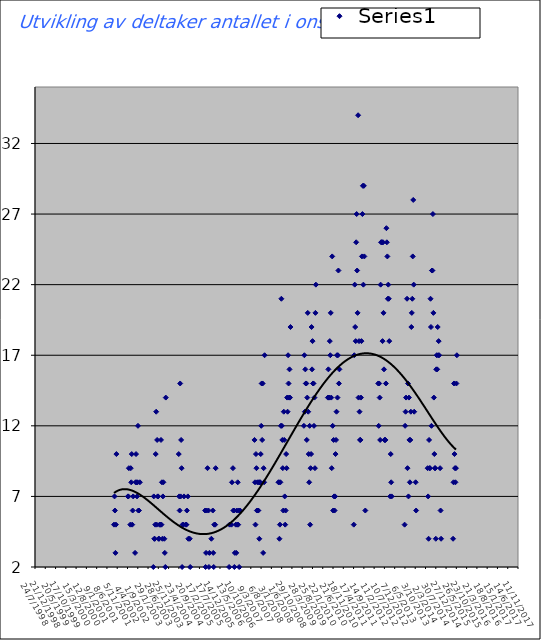
| Category | Series 0 |
|---|---|
| 37153.0 | 5 |
| 37161.0 | 7 |
| 37167.0 | 6 |
| 37174.0 | 3 |
| 37181.0 | 5 |
| 37188.0 | 10 |
| 37356.0 | 7 |
| 37363.0 | 7 |
| 37370.0 | 9 |
| 37391.0 | 5 |
| 37398.0 | 9 |
| 37405.0 | 8 |
| 37412.0 | 10 |
| 37419.0 | 5 |
| 37426.0 | 6 |
| 37433.0 | 7 |
| 37461.0 | 3 |
| 37468.0 | 8 |
| 37475.0 | 10 |
| 37482.0 | 8 |
| 37489.0 | 7 |
| 37496.0 | 8 |
| 37503.0 | 12 |
| 37510.0 | 6 |
| 37517.0 | 6 |
| 37531.0 | 8 |
| 37727.0 | 2 |
| 37734.0 | 7 |
| 37741.0 | 4 |
| 37748.0 | 4 |
| 37755.0 | 5 |
| 37762.0 | 10 |
| 37769.0 | 13 |
| 37776.0 | 5 |
| 37783.0 | 11 |
| 37790.0 | 7 |
| 37797.0 | 7 |
| 37804.0 | 4 |
| 37811.0 | 4 |
| 37818.0 | 5 |
| 37825.0 | 5 |
| 37832.0 | 5 |
| 37839.0 | 11 |
| 37846.0 | 5 |
| 37853.0 | 8 |
| 37860.0 | 4 |
| 37867.0 | 7 |
| 37874.0 | 8 |
| 37888.0 | 4 |
| 37895.0 | 3 |
| 37902.0 | 2 |
| 37909.0 | 14 |
| 38098.0 | 10 |
| 38105.0 | 7 |
| 38112.0 | 6 |
| 38119.0 | 15 |
| 38126.0 | 7 |
| 38133.0 | 11 |
| 38140.0 | 9 |
| 38147.0 | 2 |
| 38154.0 | 5 |
| 38168.0 | 5 |
| 38175.0 | 7 |
| 38203.0 | 5 |
| 38210.0 | 5 |
| 38217.0 | 6 |
| 38231.0 | 7 |
| 38238.0 | 4 |
| 38259.0 | 4 |
| 38266.0 | 2 |
| 38483.0 | 6 |
| 38490.0 | 2 |
| 38497.0 | 3 |
| 38504.0 | 6 |
| 38511.0 | 0 |
| 38518.0 | 9 |
| 38525.0 | 0 |
| 38532.0 | 6 |
| 38539.0 | 2 |
| 38546.0 | 3 |
| 38553.0 | 0 |
| 38560.0 | 0 |
| 38567.0 | 0 |
| 38574.0 | 4 |
| 38581.0 | 0 |
| 38588.0 | 0 |
| 38595.0 | 6 |
| 38602.0 | 3 |
| 38609.0 | 2 |
| 38616.0 | 5 |
| 38623.0 | 0 |
| 38630.0 | 5 |
| 38637.0 | 9 |
| 38833.0 | 2 |
| 38840.0 | 5 |
| 38847.0 | 0 |
| 38854.0 | 0 |
| 38861.0 | 0 |
| 38868.0 | 5 |
| 38875.0 | 8 |
| 38882.0 | 0 |
| 38889.0 | 9 |
| 38896.0 | 6 |
| 38903.0 | 6 |
| 38910.0 | 2 |
| 38917.0 | 3 |
| 38924.0 | 0 |
| 38931.0 | 5 |
| 38938.0 | 3 |
| 38945.0 | 6 |
| 38952.0 | 5 |
| 38959.0 | 8 |
| 38966.0 | 5 |
| 38973.0 | 6 |
| 38980.0 | 2 |
| 38987.0 | 0 |
| 38994.0 | 6 |
| 39204.0 | 11 |
| 39211.0 | 8 |
| 39218.0 | 5 |
| 39225.0 | 10 |
| 39232.0 | 9 |
| 39239.0 | 6 |
| 39246.0 | 8 |
| 39253.0 | 6 |
| 39260.0 | 6 |
| 39267.0 | 8 |
| 39274.0 | 4 |
| 39281.0 | 8 |
| 39288.0 | 8 |
| 39295.0 | 10 |
| 39302.0 | 12 |
| 39309.0 | 15 |
| 39316.0 | 11 |
| 39323.0 | 15 |
| 39330.0 | 3 |
| 39337.0 | 9 |
| 39344.0 | 8 |
| 39351.0 | 17 |
| 39554.0 | 8 |
| 39561.0 | 8 |
| 39568.0 | 4 |
| 39575.0 | 5 |
| 39582.0 | 8 |
| 39589.0 | 12 |
| 39596.0 | 21 |
| 39603.0 | 12 |
| 39610.0 | 11 |
| 39617.0 | 9 |
| 39624.0 | 6 |
| 39631.0 | 13 |
| 39638.0 | 11 |
| 39645.0 | 7 |
| 39652.0 | 5 |
| 39659.0 | 6 |
| 39666.0 | 10 |
| 39673.0 | 9 |
| 39680.0 | 14 |
| 39687.0 | 13 |
| 39694.0 | 17 |
| 39701.0 | 15 |
| 39708.0 | 14 |
| 39715.0 | 16 |
| 39722.0 | 14 |
| 39729.0 | 19 |
| 39925.0 | 12 |
| 39932.0 | 17 |
| 39939.0 | 13 |
| 39946.0 | 16 |
| 39953.0 | 15 |
| 39960.0 | 15 |
| 39967.0 | 11 |
| 39974.0 | 14 |
| 39981.0 | 20 |
| 39988.0 | 13 |
| 39995.0 | 10 |
| 40002.0 | 8 |
| 40009.0 | 12 |
| 40016.0 | 5 |
| 40023.0 | 9 |
| 40030.0 | 10 |
| 40037.0 | 19 |
| 40044.0 | 16 |
| 40051.0 | 18 |
| 40058.0 | 15 |
| 40065.0 | 15 |
| 40072.0 | 12 |
| 40079.0 | 14 |
| 40086.0 | 9 |
| 40093.0 | 20 |
| 40100.0 | 22 |
| 40275.0 | 14 |
| 40282.0 | 16 |
| 40289.0 | 14 |
| 40296.0 | 14 |
| 40303.0 | 18 |
| 40310.0 | 17 |
| 40317.0 | 20 |
| 40324.0 | 14 |
| 40331.0 | 9 |
| 40338.0 | 24 |
| 40345.0 | 12 |
| 40352.0 | 6 |
| 40359.0 | 11 |
| 40366.0 | 7 |
| 40373.0 | 6 |
| 40380.0 | 7 |
| 40387.0 | 10 |
| 40394.0 | 11 |
| 40401.0 | 13 |
| 40408.0 | 17 |
| 40415.0 | 14 |
| 40422.0 | 17 |
| 40429.0 | 23 |
| 40436.0 | 15 |
| 40443.0 | 16 |
| 40450.0 | 0 |
| 40653.0 | 5 |
| 40660.0 | 17 |
| 40667.0 | 22 |
| 40674.0 | 19 |
| 40681.0 | 18 |
| 40688.0 | 25 |
| 40695.0 | 27 |
| 40702.0 | 23 |
| 40709.0 | 20 |
| 40716.0 | 34 |
| 40723.0 | 14 |
| 40730.0 | 18 |
| 40737.0 | 13 |
| 40744.0 | 11 |
| 40751.0 | 11 |
| 40758.0 | 14 |
| 40765.0 | 18 |
| 40772.0 | 24 |
| 40779.0 | 27 |
| 40786.0 | 29 |
| 40793.0 | 22 |
| 40800.0 | 29 |
| 40807.0 | 24 |
| 40814.0 | 40 |
| 40821.0 | 6 |
| 41010.0 | 15 |
| 41017.0 | 12 |
| 41024.0 | 15 |
| 41031.0 | 14 |
| 41038.0 | 11 |
| 41045.0 | 22 |
| 41052.0 | 25 |
| 41059.0 | 25 |
| 41066.0 | 25 |
| 41073.0 | 18 |
| 41080.0 | 25 |
| 41087.0 | 20 |
| 41094.0 | 16 |
| 41101.0 | 11 |
| 41108.0 | 11 |
| 41115.0 | 11 |
| 41122.0 | 15 |
| 41129.0 | 26 |
| 41136.0 | 25 |
| 41143.0 | 24 |
| 41150.0 | 21 |
| 41157.0 | 22 |
| 41164.0 | 21 |
| 41171.0 | 18 |
| 41178.0 | 0 |
| 41185.0 | 7 |
| 41192.0 | 10 |
| 41199.0 | 8 |
| 41206.0 | 7 |
| 41395.0 | 5 |
| 41402.0 | 12 |
| 41409.0 | 13 |
| 41416.0 | 14 |
| 41423.0 | 1 |
| 41430.0 | 21 |
| 41437.0 | 9 |
| 41444.0 | 15 |
| 41451.0 | 7 |
| 41458.0 | 14 |
| 41465.0 | 11 |
| 41472.0 | 8 |
| 41479.0 | 11 |
| 41486.0 | 13 |
| 41493.0 | 19 |
| 41500.0 | 20 |
| 41507.0 | 21 |
| 41514.0 | 24 |
| 41521.0 | 28 |
| 41528.0 | 22 |
| 41535.0 | 13 |
| 41542.0 | 0 |
| 41549.0 | 0 |
| 41556.0 | 8 |
| 41563.0 | 6 |
| 41731.0 | 9 |
| 41738.0 | 7 |
| 41745.0 | 4 |
| 41752.0 | 11 |
| 41759.0 | 9 |
| 41766.0 | 9 |
| 41773.0 | 21 |
| 41780.0 | 19 |
| 41787.0 | 12 |
| 41794.0 | 23 |
| 41801.0 | 23 |
| 41808.0 | 27 |
| 41815.0 | 20 |
| 41822.0 | 14 |
| 41829.0 | 10 |
| 41836.0 | 9 |
| 41843.0 | 9 |
| 41850.0 | 4 |
| 41857.0 | 16 |
| 41864.0 | 17 |
| 41871.0 | 16 |
| 41878.0 | 19 |
| 41885.0 | 17 |
| 41892.0 | 18 |
| 41899.0 | 17 |
| 41906.0 | 1 |
| 41913.0 | 9 |
| 41920.0 | 6 |
| 41927.0 | 4 |
| 42102.0 | 4 |
| 42109.0 | 8 |
| 42116.0 | 15 |
| 42123.0 | 10 |
| 42130.0 | 9 |
| 42137.0 | 8 |
| 42144.0 | 9 |
| 42151.0 | 15 |
| 42158.0 | 17 |